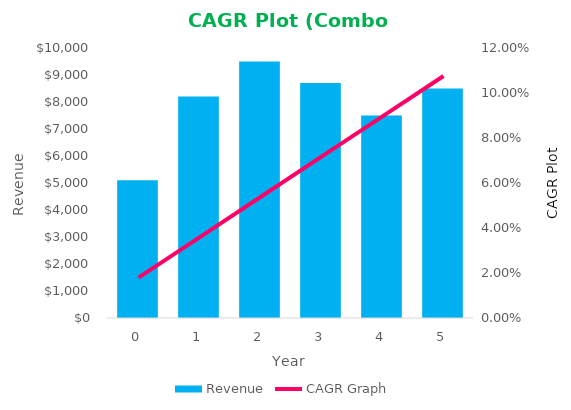
| Category | Revenue |
|---|---|
| 0.0 | 5100 |
| 1.0 | 8200 |
| 2.0 | 9500 |
| 3.0 | 8700 |
| 4.0 | 7500 |
| 5.0 | 8500 |